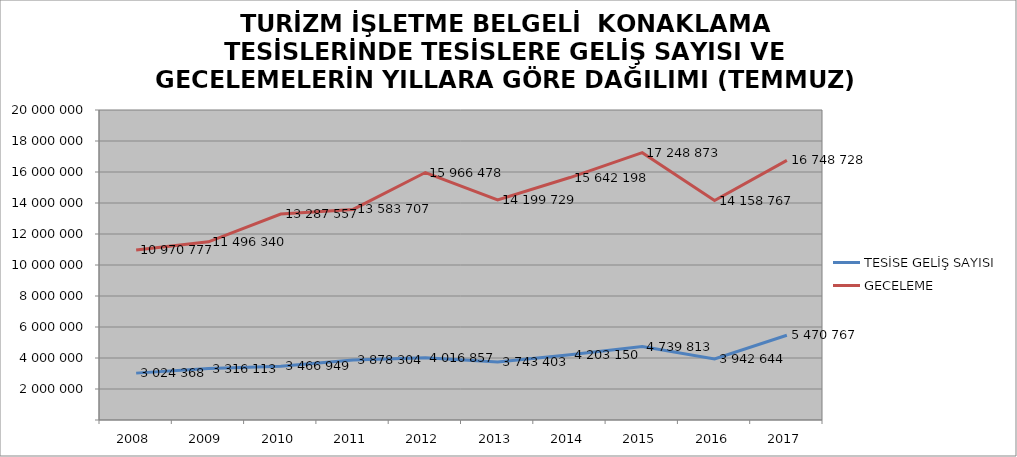
| Category | TESİSE GELİŞ SAYISI | GECELEME |
|---|---|---|
| 2008 | 3024368 | 10970777 |
| 2009 | 3316113 | 11496340 |
| 2010 | 3466949 | 13287557 |
| 2011 | 3878304 | 13583707 |
| 2012 | 4016857 | 15966478 |
| 2013 | 3743403 | 14199729 |
| 2014 | 4203150 | 15642198 |
| 2015 | 4739813 | 17248873 |
| 2016 | 3942644 | 14158767 |
| 2017 | 5470767 | 16748728 |